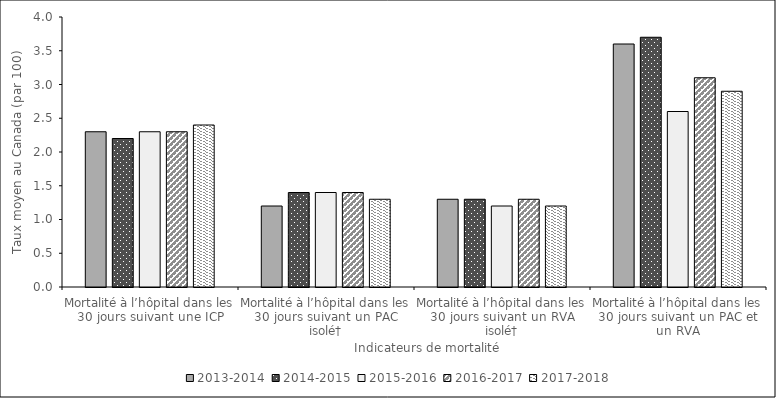
| Category | 2013-2014 | 2014-2015 | 2015-2016 | 2016-2017 | 2017-2018 |
|---|---|---|---|---|---|
| Mortalité à l’hôpital dans les 30 jours suivant une ICP | 2.3 | 2.2 | 2.3 | 2.3 | 2.4 |
| Mortalité à l’hôpital dans les 30 jours suivant un PAC isolé† | 1.2 | 1.4 | 1.4 | 1.4 | 1.3 |
| Mortalité à l’hôpital dans les 30 jours suivant un RVA isolé† | 1.3 | 1.3 | 1.2 | 1.3 | 1.2 |
| Mortalité à l’hôpital dans les 30 jours suivant un PAC et un RVA | 3.6 | 3.7 | 2.6 | 3.1 | 2.9 |